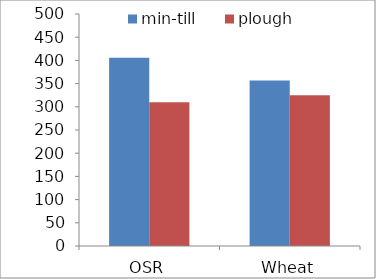
| Category | min-till | plough |
|---|---|---|
| OSR | 405.509 | 309.742 |
| Wheat | 356.451 | 325.087 |